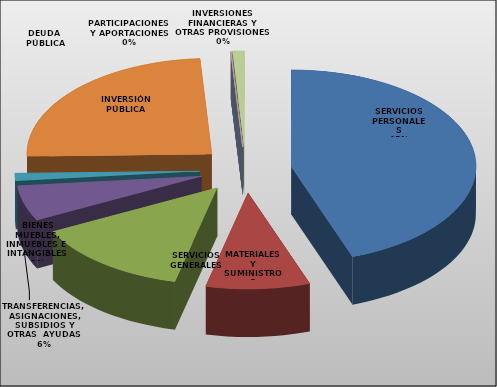
| Category | Series 0 |
|---|---|
| SERVICIOS PERSONALES | 13201462 |
| MATERIALES Y SUMINISTROS | 2686843 |
| SERVICIOS GENERALES | 4077769 |
| TRANSFERENCIAS, ASIGNACIONES, SUBSIDIOS Y OTRAS  AYUDAS | 1760263 |
| BIENES MUEBLES, INMUEBLES E  INTANGIBLES  | 371297 |
| INVERSIÓN PÚBLICA | 7199325 |
| INVERSIONES FINANCIERAS Y OTRAS PROVISIONES | 0 |
| PARTICIPACIONES Y APORTACIONES | 0 |
| DEUDA  PÚBLICA | 302147 |